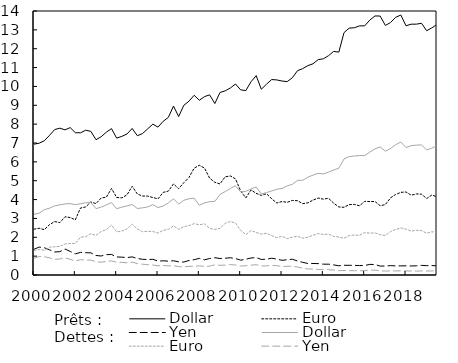
| Category | Dollar | Euro | Yen |
|---|---|---|---|
| 2000.0 | 3.216 | 1.303 | 0.884 |
| nan | 3.277 | 1.35 | 0.98 |
| nan | 3.463 | 1.316 | 0.967 |
| nan | 3.542 | 1.474 | 0.91 |
| 2001.0 | 3.668 | 1.496 | 0.834 |
| nan | 3.718 | 1.52 | 0.848 |
| nan | 3.77 | 1.646 | 0.911 |
| nan | 3.786 | 1.672 | 0.831 |
| 2002.0 | 3.731 | 1.673 | 0.737 |
| nan | 3.778 | 2.005 | 0.814 |
| nan | 3.834 | 2.03 | 0.786 |
| nan | 3.84 | 2.187 | 0.794 |
| 2003.0 | 3.519 | 2.101 | 0.697 |
| nan | 3.602 | 2.303 | 0.683 |
| nan | 3.718 | 2.41 | 0.721 |
| nan | 3.84 | 2.644 | 0.749 |
| 2004.0 | 3.515 | 2.285 | 0.679 |
| nan | 3.598 | 2.33 | 0.666 |
| nan | 3.663 | 2.444 | 0.649 |
| nan | 3.736 | 2.701 | 0.679 |
| 2005.0 | 3.526 | 2.441 | 0.608 |
| nan | 3.562 | 2.296 | 0.572 |
| nan | 3.612 | 2.32 | 0.547 |
| nan | 3.732 | 2.307 | 0.529 |
| 2006.0 | 3.576 | 2.223 | 0.487 |
| nan | 3.657 | 2.371 | 0.5 |
| nan | 3.823 | 2.42 | 0.485 |
| nan | 4.038 | 2.608 | 0.49 |
| 2007.0 | 3.759 | 2.419 | 0.445 |
| nan | 3.962 | 2.561 | 0.436 |
| nan | 4.043 | 2.617 | 0.461 |
| nan | 4.075 | 2.723 | 0.463 |
| 2008.0 | 3.699 | 2.663 | 0.481 |
| nan | 3.821 | 2.714 | 0.46 |
| nan | 3.888 | 2.475 | 0.47 |
| nan | 3.9 | 2.413 | 0.537 |
| 2009.0 | 4.275 | 2.474 | 0.514 |
| nan | 4.424 | 2.742 | 0.525 |
| nan | 4.587 | 2.836 | 0.552 |
| nan | 4.734 | 2.757 | 0.531 |
| 2010.0 | 4.403 | 2.37 | 0.473 |
| nan | 4.437 | 2.14 | 0.492 |
| nan | 4.56 | 2.358 | 0.525 |
| nan | 4.667 | 2.252 | 0.544 |
| 2011.0 | 4.303 | 2.169 | 0.478 |
| nan | 4.369 | 2.217 | 0.487 |
| nan | 4.456 | 2.089 | 0.508 |
| nan | 4.548 | 1.978 | 0.493 |
| 2012.0 | 4.589 | 2.057 | 0.451 |
| nan | 4.727 | 1.928 | 0.461 |
| nan | 4.81 | 2.008 | 0.469 |
| nan | 5.018 | 2.053 | 0.422 |
| 2013.0 | 5.021 | 1.949 | 0.356 |
| nan | 5.189 | 2.007 | 0.321 |
| nan | 5.296 | 2.105 | 0.314 |
| nan | 5.392 | 2.198 | 0.294 |
| 2014.0 | 5.359 | 2.15 | 0.283 |
| nan | 5.455 | 2.166 | 0.283 |
| nan | 5.565 | 2.051 | 0.263 |
| nan | 5.665 | 2.012 | 0.229 |
| 2015.0 | 6.153 | 1.953 | 0.24 |
| nan | 6.277 | 2.088 | 0.229 |
| nan | 6.311 | 2.119 | 0.231 |
| nan | 6.334 | 2.108 | 0.223 |
| 2016.0 | 6.334 | 2.246 | 0.234 |
| nan | 6.52 | 2.225 | 0.258 |
| nan | 6.689 | 2.229 | 0.259 |
| nan | 6.793 | 2.138 | 0.217 |
| 2017.0 | 6.565 | 2.091 | 0.212 |
| nan | 6.706 | 2.299 | 0.215 |
| nan | 6.91 | 2.416 | 0.218 |
| nan | 7.05 | 2.497 | 0.219 |
| 2018.0 | 6.76 | 2.434 | 0.217 |
| nan | 6.859 | 2.326 | 0.212 |
| nan | 6.887 | 2.371 | 0.206 |
| nan | 6.894 | 2.356 | 0.216 |
| 2019.0 | 6.632 | 2.215 | 0.209 |
| nan | 6.726 | 2.294 | 0.217 |
| nan | 6.863 | 2.25 | 0.222 |